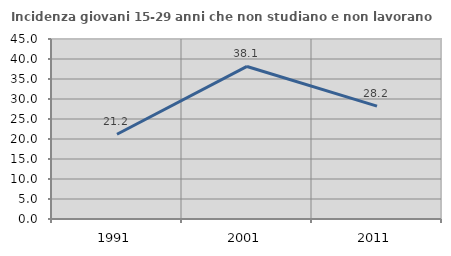
| Category | Incidenza giovani 15-29 anni che non studiano e non lavorano  |
|---|---|
| 1991.0 | 21.198 |
| 2001.0 | 38.139 |
| 2011.0 | 28.221 |